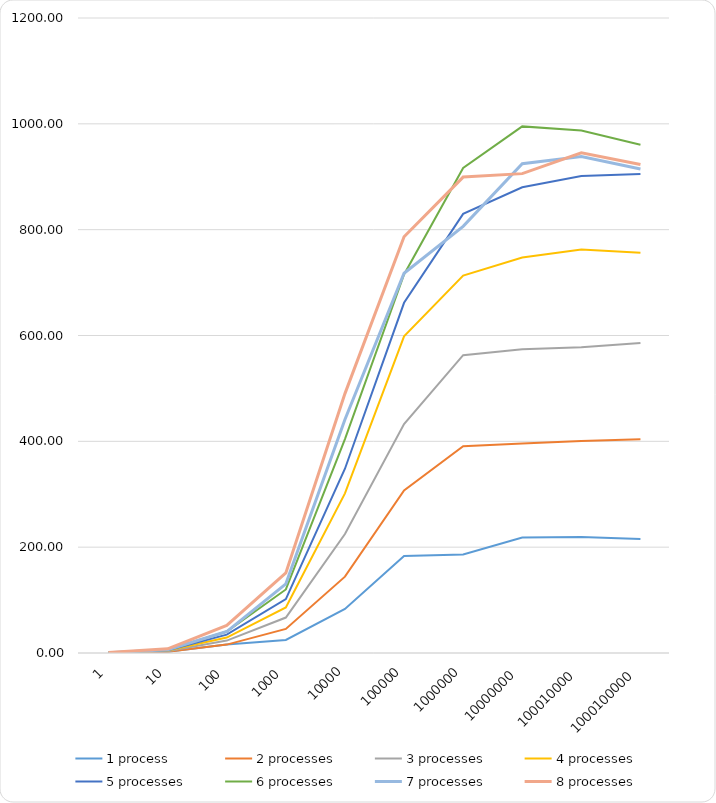
| Category | 1 process | 2 processes | 3 processes | 4 processes | 5 processes | 6 processes | 7 processes | 8 processes |
|---|---|---|---|---|---|---|---|---|
| 1.0 | 0.25 | 0.308 | 0.452 | 0.56 | 0.599 | 0.755 | 0.672 | 0.893 |
| 10.0 | 2.166 | 2.268 | 3.477 | 4.624 | 5.275 | 6.112 | 6.33 | 7.955 |
| 100.0 | 16.281 | 15.868 | 23.505 | 29.121 | 34.672 | 40.573 | 40.533 | 52.046 |
| 1000.0 | 24.588 | 45.434 | 66.979 | 86.17 | 101.833 | 120.048 | 130.67 | 151.229 |
| 10000.0 | 83.264 | 144.3 | 224.719 | 301.659 | 348.189 | 404.313 | 441.362 | 490.196 |
| 100000.0 | 183.184 | 307.409 | 432.588 | 598.444 | 661.813 | 715.393 | 717.581 | 786.627 |
| 1000000.0 | 186.254 | 390.778 | 562.746 | 713.14 | 829.876 | 916.59 | 806.266 | 899.382 |
| 10000000.0 | 218.388 | 395.883 | 574.053 | 747.245 | 880.127 | 995.19 | 924.703 | 905.9 |
| 100010000.0 | 219.046 | 400.777 | 577.736 | 762.344 | 901.3 | 987.314 | 938.054 | 945.319 |
| 1000100000.0 | 215.268 | 404.159 | 585.883 | 756.161 | 905.037 | 960.383 | 914.532 | 923.26 |